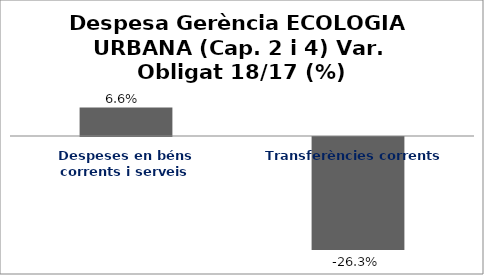
| Category | Series 0 |
|---|---|
| Despeses en béns corrents i serveis | 0.066 |
| Transferències corrents | -0.263 |